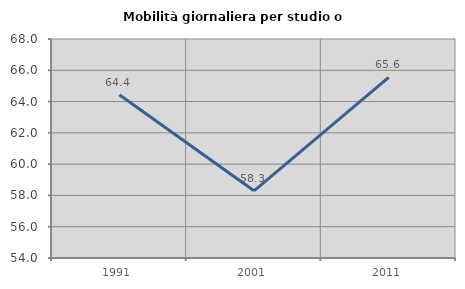
| Category | Mobilità giornaliera per studio o lavoro |
|---|---|
| 1991.0 | 64.442 |
| 2001.0 | 58.293 |
| 2011.0 | 65.551 |